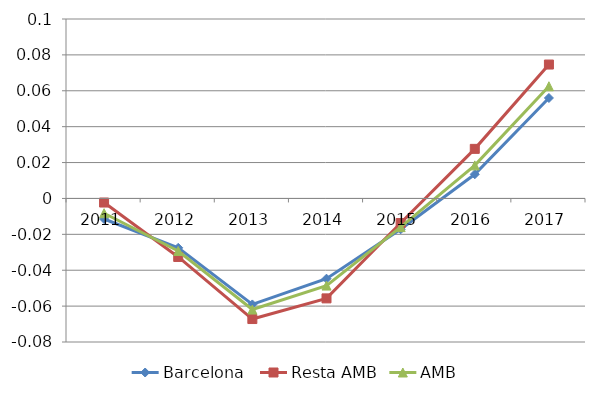
| Category | Barcelona  | Resta AMB | AMB |
|---|---|---|---|
| 2011.0 | -0.011 | -0.002 | -0.008 |
| 2012.0 | -0.028 | -0.033 | -0.029 |
| 2013.0 | -0.059 | -0.067 | -0.062 |
| 2014.0 | -0.045 | -0.056 | -0.049 |
| 2015.0 | -0.017 | -0.014 | -0.016 |
| 2016.0 | 0.013 | 0.028 | 0.018 |
| 2017.0 | 0.056 | 0.075 | 0.063 |